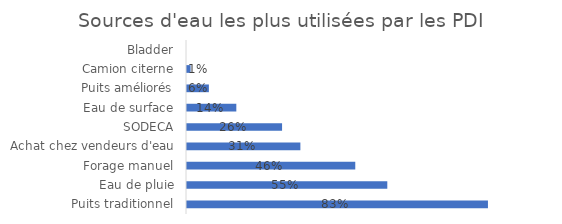
| Category | Fréquence | Reste |
|---|---|---|
| Puits traditionnel | 0.825 | 0.175 |
| Eau de pluie | 0.55 | 0.45 |
| Forage manuel | 0.462 | 0.538 |
| Achat chez vendeurs d'eau | 0.312 | 0.688 |
| SODECA | 0.262 | 0.738 |
| Eau de surface | 0.138 | 0.862 |
| Puits améliorés | 0.062 | 0.938 |
| Camion citerne | 0.012 | 0.988 |
| Bladder | 0 | 1 |